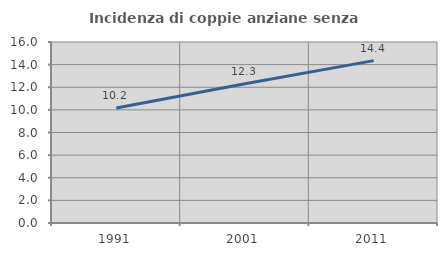
| Category | Incidenza di coppie anziane senza figli  |
|---|---|
| 1991.0 | 10.16 |
| 2001.0 | 12.308 |
| 2011.0 | 14.354 |